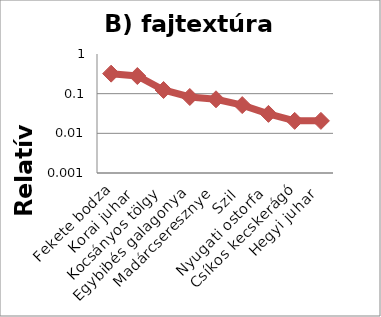
| Category | Series 0 |
|---|---|
| Fekete bodza | 0.32 |
| Korai juhar | 0.278 |
| Kocsányos tölgy | 0.124 |
| Egybibés galagonya | 0.082 |
| Madárcseresznye | 0.072 |
| Szil | 0.052 |
| Nyugati ostorfa | 0.031 |
| Csíkos kecskerágó | 0.021 |
| Hegyi juhar | 0.021 |